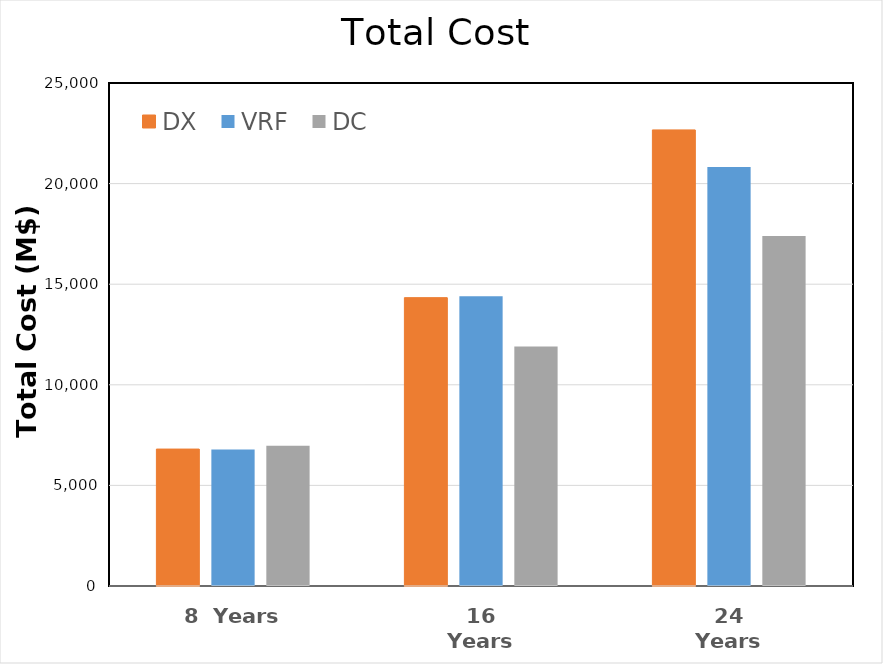
| Category | DX | VRF | DC |
|---|---|---|---|
| 8  Years | 6805.975 | 6788.772 | 6966.208 |
| 16 Years | 14331.535 | 14400.059 | 11903.749 |
| 24 Years | 22668.508 | 20828.696 | 17394.977 |